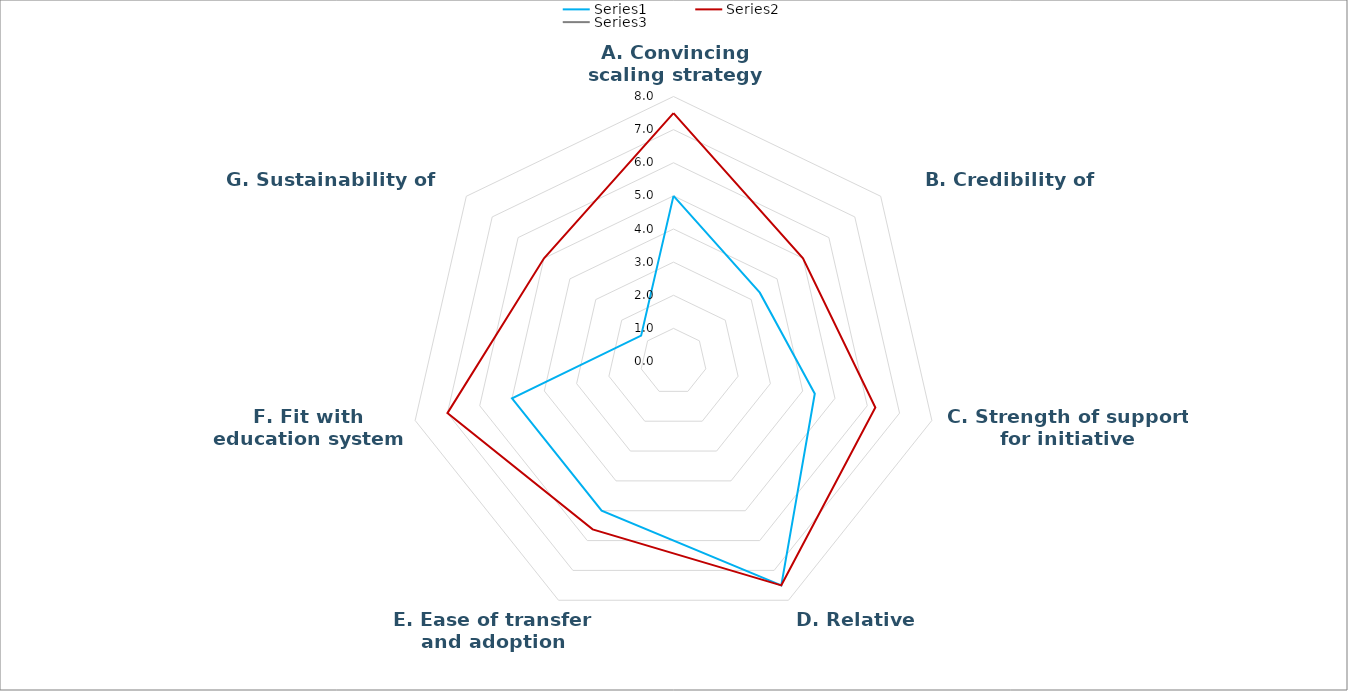
| Category | Series 0 | Series 1 | Series 2 |
|---|---|---|---|
| A. Convincing scaling strategy | 5 | 7.5 |  |
| B. Credibility of initiative | 3.333 | 5 |  |
| C. Strength of support for initiative | 4.375 | 6.25 |  |
| D. Relative advantage | 7.5 | 7.5 |  |
| E. Ease of transfer and adoption | 5 | 5.625 |  |
| F. Fit with education system | 5 | 7 |  |
| G. Sustainability of funding | 1.25 | 5 |  |